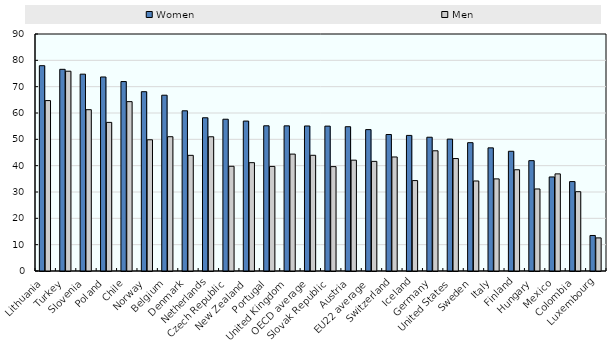
| Category | Women | Men |
|---|---|---|
| Lithuania | 77.967 | 64.717 |
| Turkey | 76.59 | 75.867 |
| Slovenia | 74.746 | 61.254 |
| Poland | 73.681 | 56.438 |
| Chile | 71.943 | 64.315 |
| Norway | 68.092 | 49.833 |
| Belgium | 66.758 | 50.996 |
| Denmark | 60.833 | 43.924 |
| Netherlands | 58.185 | 50.971 |
| Czech Republic | 57.637 | 39.771 |
| New Zealand | 56.934 | 41.141 |
| Portugal | 55.143 | 39.717 |
| United Kingdom | 55.117 | 44.393 |
| OECD average | 55.073 | 43.94 |
| Slovak Republic | 55.021 | 39.641 |
| Austria | 54.794 | 42.087 |
| EU22 average | 53.692 | 41.636 |
| Switzerland | 51.834 | 43.303 |
| Iceland | 51.488 | 34.342 |
| Germany | 50.8 | 45.65 |
| United States | 50.088 | 42.707 |
| Sweden | 48.735 | 34.184 |
| Italy | 46.763 | 34.98 |
| Finland | 45.468 | 38.444 |
| Hungary | 41.905 | 31.153 |
| Mexico | 35.714 | 36.879 |
| Colombia | 33.955 | 30.117 |
| Luxembourg | 13.489 | 12.569 |